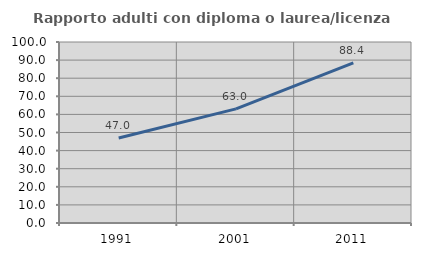
| Category | Rapporto adulti con diploma o laurea/licenza media  |
|---|---|
| 1991.0 | 46.979 |
| 2001.0 | 63.036 |
| 2011.0 | 88.414 |